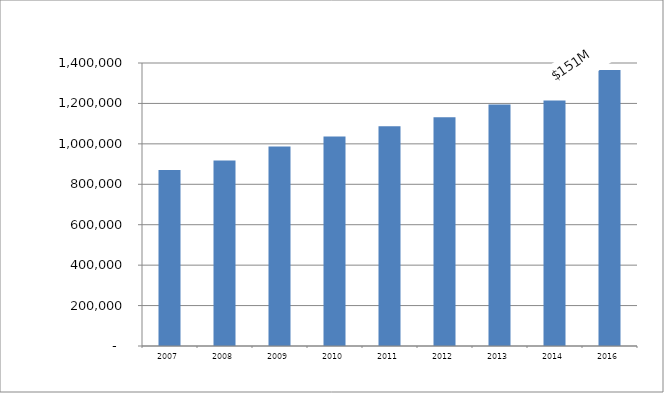
| Category | Series 0 |
|---|---|
| 2007.0 | 870835 |
| 2008.0 | 917247 |
| 2009.0 | 987243 |
| 2010.0 | 1036064 |
| 2011.0 | 1087141 |
| 2012.0 | 1131570 |
| 2013.0 | 1195010 |
| 2014.0 | 1214504 |
| 2016.0 | 1365555 |